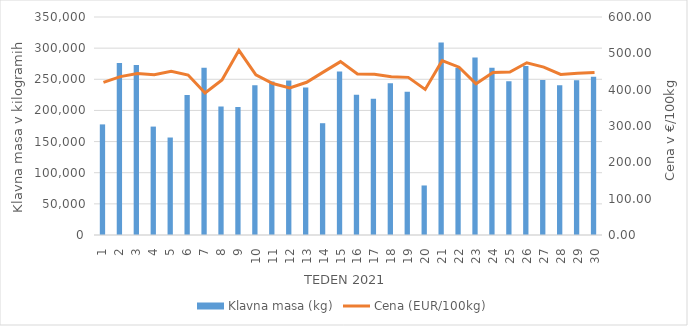
| Category | Klavna masa (kg) |
|---|---|
| 1.0 | 177573 |
| 2.0 | 275951 |
| 3.0 | 272797 |
| 4.0 | 174056 |
| 5.0 | 156508 |
| 6.0 | 224595 |
| 7.0 | 268436 |
| 8.0 | 206193 |
| 9.0 | 205669 |
| 10.0 | 240592 |
| 11.0 | 246325 |
| 12.0 | 248020 |
| 13.0 | 236703 |
| 14.0 | 179478 |
| 15.0 | 262544 |
| 16.0 | 225033 |
| 17.0 | 218950 |
| 18.0 | 243711 |
| 19.0 | 229955 |
| 20.0 | 79521 |
| 21.0 | 309134 |
| 22.0 | 268074 |
| 23.0 | 285151 |
| 24.0 | 268579 |
| 25.0 | 246944 |
| 26.0 | 271319 |
| 27.0 | 248858 |
| 28.0 | 240609 |
| 29.0 | 248383 |
| 30.0 | 253894 |